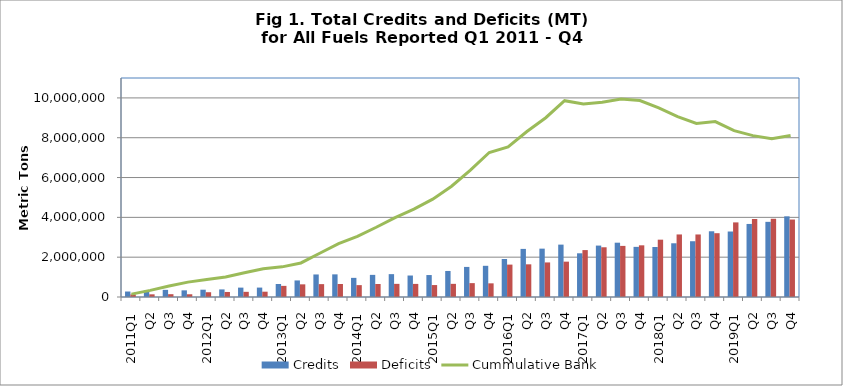
| Category | Credits | Deficits |
|---|---|---|
| 2011Q1 | 275639 | 132283 |
| Q2 | 325071 | 134760 |
| Q3 | 358817 | 141381 |
| Q4 | 334451 | 137396 |
| 2012Q1 | 366391 | 240260 |
| Q2 | 380783 | 252750 |
| Q3 | 471290 | 259582 |
| Q4 | 473045 | 266666 |
| 2013Q1 | 652535 | 558804 |
| Q2 | 832199 | 636140 |
| Q3 | 1132141 | 646613 |
| Q4 | 1137322 | 653565 |
| 2014Q1 | 961263 | 596240 |
| Q2 | 1111616 | 653122 |
| Q3 | 1148264 | 660254 |
| Q4 | 1079148 | 657732 |
| 2015Q1 | 1102964 | 600144 |
| Q2 | 1307728 | 660642 |
| Q3 | 1510776 | 696772 |
| Q4 | 1566956 | 686210 |
| 2016Q1 | 1907953 | 1627195 |
| Q2 | 2416181 | 1641557 |
| Q3 | 2428946 | 1736480 |
| Q4 | 2631117 | 1775489 |
| 2017Q1 | 2195244 | 2356219 |
| Q2 | 2582576 | 2497783 |
| Q3 | 2727782 | 2566731 |
| Q4 | 2518172 | 2595941 |
| 2018Q1 | 2510704 | 2879229 |
| Q2 | 2698412 | 3141737 |
| Q3 | 2801498 | 3140867 |
| Q4 | 3300906 | 3204670 |
| 2019Q1 | 3289327 | 3747363 |
| Q2 | 3669105 | 3918803 |
| Q3 | 3774906 | 3929456 |
| Q4 | 4051397 | 3891101 |